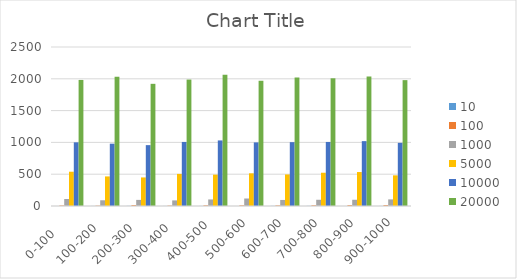
| Category | 10 | 100 | 1000 | 5000 | 10000 | 20000 |
|---|---|---|---|---|---|---|
| 0-100     | 0 | 8 | 110 | 539 | 1001 | 1982 |
| 100-200   | 1 | 5 | 90 | 465 | 980 | 2033 |
| 200-300   | 2 | 14 | 96 | 449 | 957 | 1921 |
| 300-400   | 1 | 6 | 88 | 505 | 1007 | 1988 |
| 400-500  | 1 | 10 | 103 | 493 | 1031 | 2062 |
| 500-600 | 0 | 10 | 118 | 514 | 1000 | 1969 |
| 600-700 | 2 | 9 | 95 | 496 | 1004 | 2021 |
| 700-800 | 2 | 11 | 98 | 523 | 1007 | 2008 |
| 800-900 | 0 | 13 | 98 | 534 | 1020 | 2037 |
| 900-1000 | 1 | 14 | 104 | 482 | 993 | 1979 |